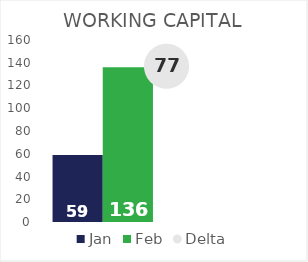
| Category | Jan | Feb |
|---|---|---|
| Working Capital | 59 | 136 |